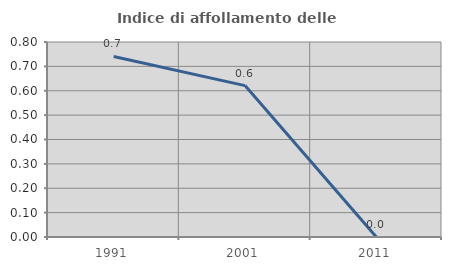
| Category | Indice di affollamento delle abitazioni  |
|---|---|
| 1991.0 | 0.741 |
| 2001.0 | 0.621 |
| 2011.0 | 0 |